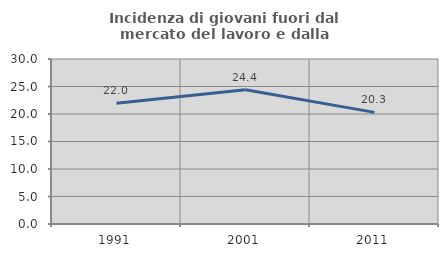
| Category | Incidenza di giovani fuori dal mercato del lavoro e dalla formazione  |
|---|---|
| 1991.0 | 21.957 |
| 2001.0 | 24.416 |
| 2011.0 | 20.294 |